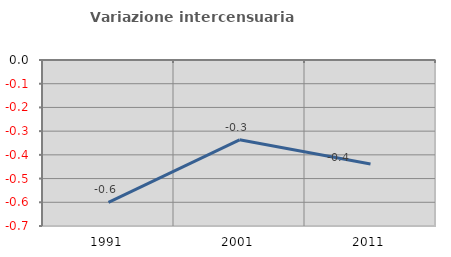
| Category | Variazione intercensuaria annua |
|---|---|
| 1991.0 | -0.6 |
| 2001.0 | -0.337 |
| 2011.0 | -0.439 |